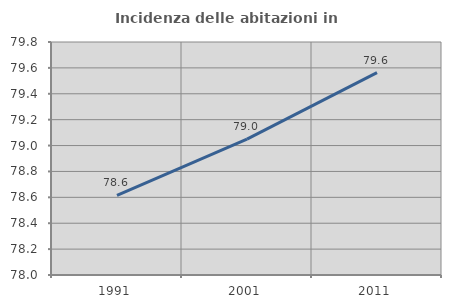
| Category | Incidenza delle abitazioni in proprietà  |
|---|---|
| 1991.0 | 78.616 |
| 2001.0 | 79.049 |
| 2011.0 | 79.564 |